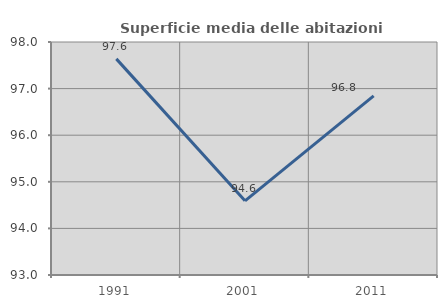
| Category | Superficie media delle abitazioni occupate |
|---|---|
| 1991.0 | 97.638 |
| 2001.0 | 94.592 |
| 2011.0 | 96.845 |